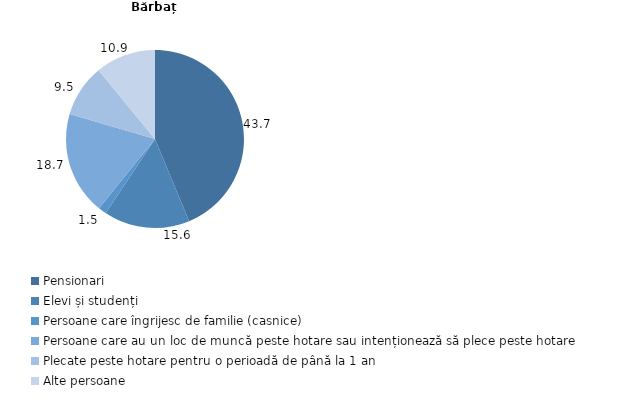
| Category | Bărbați |
|---|---|
| Pensionari | 43.734 |
| Elevi și studenți | 15.622 |
| Persoane care îngrijesc de familie (casnice) | 1.463 |
| Persoane care au un loc de muncă peste hotare sau intenționează să plece peste hotare | 18.72 |
| Plecate peste hotare pentru o perioadă de până la 1 an | 9.534 |
| Alte persoane | 10.927 |